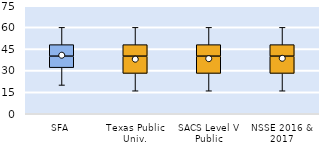
| Category | 25th | 50th | 75th |
|---|---|---|---|
| SFA | 32 | 8 | 8 |
| Texas Public Univ. | 28 | 12 | 8 |
| SACS Level V Public | 28 | 12 | 8 |
| NSSE 2016 & 2017 | 28 | 12 | 8 |